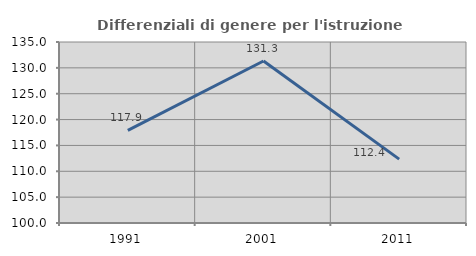
| Category | Differenziali di genere per l'istruzione superiore |
|---|---|
| 1991.0 | 117.918 |
| 2001.0 | 131.323 |
| 2011.0 | 112.354 |